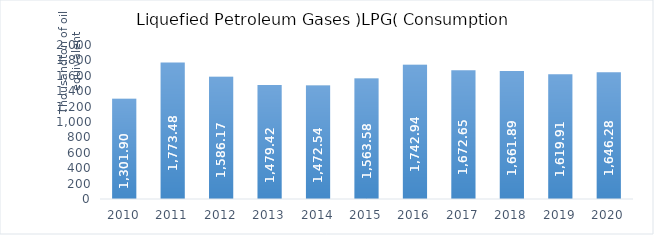
| Category | Liquefied Petroleum Gases (LPG) Consumption |
|---|---|
| 2010.0 | 1301.9 |
| 2011.0 | 1773.48 |
| 2012.0 | 1586.17 |
| 2013.0 | 1479.42 |
| 2014.0 | 1472.54 |
| 2015.0 | 1563.58 |
| 2016.0 | 1742.94 |
| 2017.0 | 1672.65 |
| 2018.0 | 1661.89 |
| 2019.0 | 1619.91 |
| 2020.0 | 1646.28 |